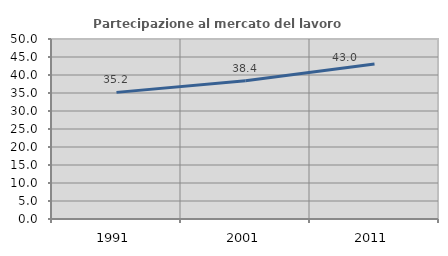
| Category | Partecipazione al mercato del lavoro  femminile |
|---|---|
| 1991.0 | 35.172 |
| 2001.0 | 38.395 |
| 2011.0 | 43.033 |